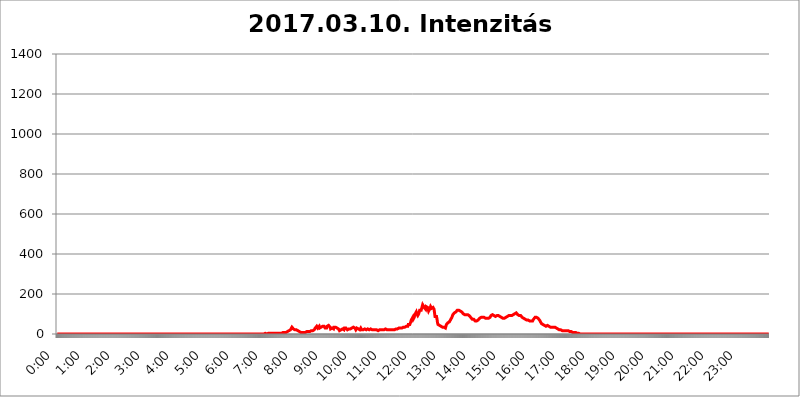
| Category | 2017.03.10. Intenzitás [W/m^2] |
|---|---|
| 0.0 | 0 |
| 0.0006944444444444445 | 0 |
| 0.001388888888888889 | 0 |
| 0.0020833333333333333 | 0 |
| 0.002777777777777778 | 0 |
| 0.003472222222222222 | 0 |
| 0.004166666666666667 | 0 |
| 0.004861111111111111 | 0 |
| 0.005555555555555556 | 0 |
| 0.0062499999999999995 | 0 |
| 0.006944444444444444 | 0 |
| 0.007638888888888889 | 0 |
| 0.008333333333333333 | 0 |
| 0.009027777777777779 | 0 |
| 0.009722222222222222 | 0 |
| 0.010416666666666666 | 0 |
| 0.011111111111111112 | 0 |
| 0.011805555555555555 | 0 |
| 0.012499999999999999 | 0 |
| 0.013194444444444444 | 0 |
| 0.013888888888888888 | 0 |
| 0.014583333333333332 | 0 |
| 0.015277777777777777 | 0 |
| 0.015972222222222224 | 0 |
| 0.016666666666666666 | 0 |
| 0.017361111111111112 | 0 |
| 0.018055555555555557 | 0 |
| 0.01875 | 0 |
| 0.019444444444444445 | 0 |
| 0.02013888888888889 | 0 |
| 0.020833333333333332 | 0 |
| 0.02152777777777778 | 0 |
| 0.022222222222222223 | 0 |
| 0.02291666666666667 | 0 |
| 0.02361111111111111 | 0 |
| 0.024305555555555556 | 0 |
| 0.024999999999999998 | 0 |
| 0.025694444444444447 | 0 |
| 0.02638888888888889 | 0 |
| 0.027083333333333334 | 0 |
| 0.027777777777777776 | 0 |
| 0.02847222222222222 | 0 |
| 0.029166666666666664 | 0 |
| 0.029861111111111113 | 0 |
| 0.030555555555555555 | 0 |
| 0.03125 | 0 |
| 0.03194444444444445 | 0 |
| 0.03263888888888889 | 0 |
| 0.03333333333333333 | 0 |
| 0.034027777777777775 | 0 |
| 0.034722222222222224 | 0 |
| 0.035416666666666666 | 0 |
| 0.036111111111111115 | 0 |
| 0.03680555555555556 | 0 |
| 0.0375 | 0 |
| 0.03819444444444444 | 0 |
| 0.03888888888888889 | 0 |
| 0.03958333333333333 | 0 |
| 0.04027777777777778 | 0 |
| 0.04097222222222222 | 0 |
| 0.041666666666666664 | 0 |
| 0.042361111111111106 | 0 |
| 0.04305555555555556 | 0 |
| 0.043750000000000004 | 0 |
| 0.044444444444444446 | 0 |
| 0.04513888888888889 | 0 |
| 0.04583333333333334 | 0 |
| 0.04652777777777778 | 0 |
| 0.04722222222222222 | 0 |
| 0.04791666666666666 | 0 |
| 0.04861111111111111 | 0 |
| 0.049305555555555554 | 0 |
| 0.049999999999999996 | 0 |
| 0.05069444444444445 | 0 |
| 0.051388888888888894 | 0 |
| 0.052083333333333336 | 0 |
| 0.05277777777777778 | 0 |
| 0.05347222222222222 | 0 |
| 0.05416666666666667 | 0 |
| 0.05486111111111111 | 0 |
| 0.05555555555555555 | 0 |
| 0.05625 | 0 |
| 0.05694444444444444 | 0 |
| 0.057638888888888885 | 0 |
| 0.05833333333333333 | 0 |
| 0.05902777777777778 | 0 |
| 0.059722222222222225 | 0 |
| 0.06041666666666667 | 0 |
| 0.061111111111111116 | 0 |
| 0.06180555555555556 | 0 |
| 0.0625 | 0 |
| 0.06319444444444444 | 0 |
| 0.06388888888888888 | 0 |
| 0.06458333333333334 | 0 |
| 0.06527777777777778 | 0 |
| 0.06597222222222222 | 0 |
| 0.06666666666666667 | 0 |
| 0.06736111111111111 | 0 |
| 0.06805555555555555 | 0 |
| 0.06874999999999999 | 0 |
| 0.06944444444444443 | 0 |
| 0.07013888888888889 | 0 |
| 0.07083333333333333 | 0 |
| 0.07152777777777779 | 0 |
| 0.07222222222222223 | 0 |
| 0.07291666666666667 | 0 |
| 0.07361111111111111 | 0 |
| 0.07430555555555556 | 0 |
| 0.075 | 0 |
| 0.07569444444444444 | 0 |
| 0.0763888888888889 | 0 |
| 0.07708333333333334 | 0 |
| 0.07777777777777778 | 0 |
| 0.07847222222222222 | 0 |
| 0.07916666666666666 | 0 |
| 0.0798611111111111 | 0 |
| 0.08055555555555556 | 0 |
| 0.08125 | 0 |
| 0.08194444444444444 | 0 |
| 0.08263888888888889 | 0 |
| 0.08333333333333333 | 0 |
| 0.08402777777777777 | 0 |
| 0.08472222222222221 | 0 |
| 0.08541666666666665 | 0 |
| 0.08611111111111112 | 0 |
| 0.08680555555555557 | 0 |
| 0.08750000000000001 | 0 |
| 0.08819444444444445 | 0 |
| 0.08888888888888889 | 0 |
| 0.08958333333333333 | 0 |
| 0.09027777777777778 | 0 |
| 0.09097222222222222 | 0 |
| 0.09166666666666667 | 0 |
| 0.09236111111111112 | 0 |
| 0.09305555555555556 | 0 |
| 0.09375 | 0 |
| 0.09444444444444444 | 0 |
| 0.09513888888888888 | 0 |
| 0.09583333333333333 | 0 |
| 0.09652777777777777 | 0 |
| 0.09722222222222222 | 0 |
| 0.09791666666666667 | 0 |
| 0.09861111111111111 | 0 |
| 0.09930555555555555 | 0 |
| 0.09999999999999999 | 0 |
| 0.10069444444444443 | 0 |
| 0.1013888888888889 | 0 |
| 0.10208333333333335 | 0 |
| 0.10277777777777779 | 0 |
| 0.10347222222222223 | 0 |
| 0.10416666666666667 | 0 |
| 0.10486111111111111 | 0 |
| 0.10555555555555556 | 0 |
| 0.10625 | 0 |
| 0.10694444444444444 | 0 |
| 0.1076388888888889 | 0 |
| 0.10833333333333334 | 0 |
| 0.10902777777777778 | 0 |
| 0.10972222222222222 | 0 |
| 0.1111111111111111 | 0 |
| 0.11180555555555556 | 0 |
| 0.11180555555555556 | 0 |
| 0.1125 | 0 |
| 0.11319444444444444 | 0 |
| 0.11388888888888889 | 0 |
| 0.11458333333333333 | 0 |
| 0.11527777777777777 | 0 |
| 0.11597222222222221 | 0 |
| 0.11666666666666665 | 0 |
| 0.1173611111111111 | 0 |
| 0.11805555555555557 | 0 |
| 0.11944444444444445 | 0 |
| 0.12013888888888889 | 0 |
| 0.12083333333333333 | 0 |
| 0.12152777777777778 | 0 |
| 0.12222222222222223 | 0 |
| 0.12291666666666667 | 0 |
| 0.12291666666666667 | 0 |
| 0.12361111111111112 | 0 |
| 0.12430555555555556 | 0 |
| 0.125 | 0 |
| 0.12569444444444444 | 0 |
| 0.12638888888888888 | 0 |
| 0.12708333333333333 | 0 |
| 0.16875 | 0 |
| 0.12847222222222224 | 0 |
| 0.12916666666666668 | 0 |
| 0.12986111111111112 | 0 |
| 0.13055555555555556 | 0 |
| 0.13125 | 0 |
| 0.13194444444444445 | 0 |
| 0.1326388888888889 | 0 |
| 0.13333333333333333 | 0 |
| 0.13402777777777777 | 0 |
| 0.13402777777777777 | 0 |
| 0.13472222222222222 | 0 |
| 0.13541666666666666 | 0 |
| 0.1361111111111111 | 0 |
| 0.13749999999999998 | 0 |
| 0.13819444444444443 | 0 |
| 0.1388888888888889 | 0 |
| 0.13958333333333334 | 0 |
| 0.14027777777777778 | 0 |
| 0.14097222222222222 | 0 |
| 0.14166666666666666 | 0 |
| 0.1423611111111111 | 0 |
| 0.14305555555555557 | 0 |
| 0.14375000000000002 | 0 |
| 0.14444444444444446 | 0 |
| 0.1451388888888889 | 0 |
| 0.1451388888888889 | 0 |
| 0.14652777777777778 | 0 |
| 0.14722222222222223 | 0 |
| 0.14791666666666667 | 0 |
| 0.1486111111111111 | 0 |
| 0.14930555555555555 | 0 |
| 0.15 | 0 |
| 0.15069444444444444 | 0 |
| 0.15138888888888888 | 0 |
| 0.15208333333333332 | 0 |
| 0.15277777777777776 | 0 |
| 0.15347222222222223 | 0 |
| 0.15416666666666667 | 0 |
| 0.15486111111111112 | 0 |
| 0.15555555555555556 | 0 |
| 0.15625 | 0 |
| 0.15694444444444444 | 0 |
| 0.15763888888888888 | 0 |
| 0.15833333333333333 | 0 |
| 0.15902777777777777 | 0 |
| 0.15972222222222224 | 0 |
| 0.16041666666666668 | 0 |
| 0.16111111111111112 | 0 |
| 0.16180555555555556 | 0 |
| 0.1625 | 0 |
| 0.16319444444444445 | 0 |
| 0.1638888888888889 | 0 |
| 0.16458333333333333 | 0 |
| 0.16527777777777777 | 0 |
| 0.16597222222222222 | 0 |
| 0.16666666666666666 | 0 |
| 0.1673611111111111 | 0 |
| 0.16805555555555554 | 0 |
| 0.16874999999999998 | 0 |
| 0.16944444444444443 | 0 |
| 0.17013888888888887 | 0 |
| 0.1708333333333333 | 0 |
| 0.17152777777777775 | 0 |
| 0.17222222222222225 | 0 |
| 0.1729166666666667 | 0 |
| 0.17361111111111113 | 0 |
| 0.17430555555555557 | 0 |
| 0.17500000000000002 | 0 |
| 0.17569444444444446 | 0 |
| 0.1763888888888889 | 0 |
| 0.17708333333333334 | 0 |
| 0.17777777777777778 | 0 |
| 0.17847222222222223 | 0 |
| 0.17916666666666667 | 0 |
| 0.1798611111111111 | 0 |
| 0.18055555555555555 | 0 |
| 0.18125 | 0 |
| 0.18194444444444444 | 0 |
| 0.1826388888888889 | 0 |
| 0.18333333333333335 | 0 |
| 0.1840277777777778 | 0 |
| 0.18472222222222223 | 0 |
| 0.18541666666666667 | 0 |
| 0.18611111111111112 | 0 |
| 0.18680555555555556 | 0 |
| 0.1875 | 0 |
| 0.18819444444444444 | 0 |
| 0.18888888888888888 | 0 |
| 0.18958333333333333 | 0 |
| 0.19027777777777777 | 0 |
| 0.1909722222222222 | 0 |
| 0.19166666666666665 | 0 |
| 0.19236111111111112 | 0 |
| 0.19305555555555554 | 0 |
| 0.19375 | 0 |
| 0.19444444444444445 | 0 |
| 0.1951388888888889 | 0 |
| 0.19583333333333333 | 0 |
| 0.19652777777777777 | 0 |
| 0.19722222222222222 | 0 |
| 0.19791666666666666 | 0 |
| 0.1986111111111111 | 0 |
| 0.19930555555555554 | 0 |
| 0.19999999999999998 | 0 |
| 0.20069444444444443 | 0 |
| 0.20138888888888887 | 0 |
| 0.2020833333333333 | 0 |
| 0.2027777777777778 | 0 |
| 0.2034722222222222 | 0 |
| 0.2041666666666667 | 0 |
| 0.20486111111111113 | 0 |
| 0.20555555555555557 | 0 |
| 0.20625000000000002 | 0 |
| 0.20694444444444446 | 0 |
| 0.2076388888888889 | 0 |
| 0.20833333333333334 | 0 |
| 0.20902777777777778 | 0 |
| 0.20972222222222223 | 0 |
| 0.21041666666666667 | 0 |
| 0.2111111111111111 | 0 |
| 0.21180555555555555 | 0 |
| 0.2125 | 0 |
| 0.21319444444444444 | 0 |
| 0.2138888888888889 | 0 |
| 0.21458333333333335 | 0 |
| 0.2152777777777778 | 0 |
| 0.21597222222222223 | 0 |
| 0.21666666666666667 | 0 |
| 0.21736111111111112 | 0 |
| 0.21805555555555556 | 0 |
| 0.21875 | 0 |
| 0.21944444444444444 | 0 |
| 0.22013888888888888 | 0 |
| 0.22083333333333333 | 0 |
| 0.22152777777777777 | 0 |
| 0.2222222222222222 | 0 |
| 0.22291666666666665 | 0 |
| 0.2236111111111111 | 0 |
| 0.22430555555555556 | 0 |
| 0.225 | 0 |
| 0.22569444444444445 | 0 |
| 0.2263888888888889 | 0 |
| 0.22708333333333333 | 0 |
| 0.22777777777777777 | 0 |
| 0.22847222222222222 | 0 |
| 0.22916666666666666 | 0 |
| 0.2298611111111111 | 0 |
| 0.23055555555555554 | 0 |
| 0.23124999999999998 | 0 |
| 0.23194444444444443 | 0 |
| 0.23263888888888887 | 0 |
| 0.2333333333333333 | 0 |
| 0.2340277777777778 | 0 |
| 0.2347222222222222 | 0 |
| 0.2354166666666667 | 0 |
| 0.23611111111111113 | 0 |
| 0.23680555555555557 | 0 |
| 0.23750000000000002 | 0 |
| 0.23819444444444446 | 0 |
| 0.2388888888888889 | 0 |
| 0.23958333333333334 | 0 |
| 0.24027777777777778 | 0 |
| 0.24097222222222223 | 0 |
| 0.24166666666666667 | 0 |
| 0.2423611111111111 | 0 |
| 0.24305555555555555 | 0 |
| 0.24375 | 0 |
| 0.24444444444444446 | 0 |
| 0.24513888888888888 | 0 |
| 0.24583333333333335 | 0 |
| 0.2465277777777778 | 0 |
| 0.24722222222222223 | 0 |
| 0.24791666666666667 | 0 |
| 0.24861111111111112 | 0 |
| 0.24930555555555556 | 0 |
| 0.25 | 0 |
| 0.25069444444444444 | 0 |
| 0.2513888888888889 | 0 |
| 0.2520833333333333 | 0 |
| 0.25277777777777777 | 0 |
| 0.2534722222222222 | 0 |
| 0.25416666666666665 | 0 |
| 0.2548611111111111 | 0 |
| 0.2555555555555556 | 0 |
| 0.25625000000000003 | 0 |
| 0.2569444444444445 | 0 |
| 0.2576388888888889 | 0 |
| 0.25833333333333336 | 0 |
| 0.2590277777777778 | 0 |
| 0.25972222222222224 | 0 |
| 0.2604166666666667 | 0 |
| 0.2611111111111111 | 0 |
| 0.26180555555555557 | 0 |
| 0.2625 | 0 |
| 0.26319444444444445 | 0 |
| 0.2638888888888889 | 0 |
| 0.26458333333333334 | 0 |
| 0.2652777777777778 | 0 |
| 0.2659722222222222 | 0 |
| 0.26666666666666666 | 0 |
| 0.2673611111111111 | 0 |
| 0.26805555555555555 | 0 |
| 0.26875 | 0 |
| 0.26944444444444443 | 0 |
| 0.2701388888888889 | 0 |
| 0.2708333333333333 | 0 |
| 0.27152777777777776 | 0 |
| 0.2722222222222222 | 0 |
| 0.27291666666666664 | 0 |
| 0.2736111111111111 | 0 |
| 0.2743055555555555 | 0 |
| 0.27499999999999997 | 0 |
| 0.27569444444444446 | 0 |
| 0.27638888888888885 | 0 |
| 0.27708333333333335 | 0 |
| 0.2777777777777778 | 0 |
| 0.27847222222222223 | 0 |
| 0.2791666666666667 | 0 |
| 0.2798611111111111 | 0 |
| 0.28055555555555556 | 0 |
| 0.28125 | 0 |
| 0.28194444444444444 | 0 |
| 0.2826388888888889 | 0 |
| 0.2833333333333333 | 0 |
| 0.28402777777777777 | 0 |
| 0.2847222222222222 | 0 |
| 0.28541666666666665 | 0 |
| 0.28611111111111115 | 0 |
| 0.28680555555555554 | 0 |
| 0.28750000000000003 | 0 |
| 0.2881944444444445 | 0 |
| 0.2888888888888889 | 0 |
| 0.28958333333333336 | 0 |
| 0.2902777777777778 | 0 |
| 0.29097222222222224 | 0 |
| 0.2916666666666667 | 3.525 |
| 0.2923611111111111 | 3.525 |
| 0.29305555555555557 | 0 |
| 0.29375 | 0 |
| 0.29444444444444445 | 3.525 |
| 0.2951388888888889 | 3.525 |
| 0.29583333333333334 | 3.525 |
| 0.2965277777777778 | 3.525 |
| 0.2972222222222222 | 3.525 |
| 0.29791666666666666 | 3.525 |
| 0.2986111111111111 | 3.525 |
| 0.29930555555555555 | 3.525 |
| 0.3 | 3.525 |
| 0.30069444444444443 | 3.525 |
| 0.3013888888888889 | 3.525 |
| 0.3020833333333333 | 3.525 |
| 0.30277777777777776 | 3.525 |
| 0.3034722222222222 | 3.525 |
| 0.30416666666666664 | 3.525 |
| 0.3048611111111111 | 3.525 |
| 0.3055555555555555 | 3.525 |
| 0.30624999999999997 | 3.525 |
| 0.3069444444444444 | 3.525 |
| 0.3076388888888889 | 3.525 |
| 0.30833333333333335 | 3.525 |
| 0.3090277777777778 | 3.525 |
| 0.30972222222222223 | 3.525 |
| 0.3104166666666667 | 3.525 |
| 0.3111111111111111 | 3.525 |
| 0.31180555555555556 | 3.525 |
| 0.3125 | 3.525 |
| 0.31319444444444444 | 3.525 |
| 0.3138888888888889 | 3.525 |
| 0.3145833333333333 | 3.525 |
| 0.31527777777777777 | 7.887 |
| 0.3159722222222222 | 7.887 |
| 0.31666666666666665 | 7.887 |
| 0.31736111111111115 | 7.887 |
| 0.31805555555555554 | 7.887 |
| 0.31875000000000003 | 7.887 |
| 0.3194444444444445 | 7.887 |
| 0.3201388888888889 | 7.887 |
| 0.32083333333333336 | 7.887 |
| 0.3215277777777778 | 7.887 |
| 0.32222222222222224 | 12.257 |
| 0.3229166666666667 | 12.257 |
| 0.3236111111111111 | 12.257 |
| 0.32430555555555557 | 12.257 |
| 0.325 | 16.636 |
| 0.32569444444444445 | 16.636 |
| 0.3263888888888889 | 16.636 |
| 0.32708333333333334 | 21.024 |
| 0.3277777777777778 | 21.024 |
| 0.3284722222222222 | 25.419 |
| 0.32916666666666666 | 34.234 |
| 0.3298611111111111 | 38.653 |
| 0.33055555555555555 | 29.823 |
| 0.33125 | 25.419 |
| 0.33194444444444443 | 21.024 |
| 0.3326388888888889 | 21.024 |
| 0.3333333333333333 | 21.024 |
| 0.3340277777777778 | 16.636 |
| 0.3347222222222222 | 16.636 |
| 0.3354166666666667 | 21.024 |
| 0.3361111111111111 | 21.024 |
| 0.3368055555555556 | 16.636 |
| 0.33749999999999997 | 16.636 |
| 0.33819444444444446 | 12.257 |
| 0.33888888888888885 | 12.257 |
| 0.33958333333333335 | 12.257 |
| 0.34027777777777773 | 12.257 |
| 0.34097222222222223 | 12.257 |
| 0.3416666666666666 | 7.887 |
| 0.3423611111111111 | 7.887 |
| 0.3430555555555555 | 7.887 |
| 0.34375 | 7.887 |
| 0.3444444444444445 | 7.887 |
| 0.3451388888888889 | 7.887 |
| 0.3458333333333334 | 7.887 |
| 0.34652777777777777 | 7.887 |
| 0.34722222222222227 | 7.887 |
| 0.34791666666666665 | 7.887 |
| 0.34861111111111115 | 7.887 |
| 0.34930555555555554 | 12.257 |
| 0.35000000000000003 | 12.257 |
| 0.3506944444444444 | 7.887 |
| 0.3513888888888889 | 7.887 |
| 0.3520833333333333 | 12.257 |
| 0.3527777777777778 | 12.257 |
| 0.3534722222222222 | 12.257 |
| 0.3541666666666667 | 12.257 |
| 0.3548611111111111 | 12.257 |
| 0.35555555555555557 | 12.257 |
| 0.35625 | 16.636 |
| 0.35694444444444445 | 16.636 |
| 0.3576388888888889 | 16.636 |
| 0.35833333333333334 | 16.636 |
| 0.3590277777777778 | 16.636 |
| 0.3597222222222222 | 16.636 |
| 0.36041666666666666 | 21.024 |
| 0.3611111111111111 | 25.419 |
| 0.36180555555555555 | 29.823 |
| 0.3625 | 29.823 |
| 0.36319444444444443 | 29.823 |
| 0.3638888888888889 | 38.653 |
| 0.3645833333333333 | 34.234 |
| 0.3652777777777778 | 29.823 |
| 0.3659722222222222 | 25.419 |
| 0.3666666666666667 | 29.823 |
| 0.3673611111111111 | 38.653 |
| 0.3680555555555556 | 29.823 |
| 0.36874999999999997 | 29.823 |
| 0.36944444444444446 | 34.234 |
| 0.37013888888888885 | 34.234 |
| 0.37083333333333335 | 38.653 |
| 0.37152777777777773 | 34.234 |
| 0.37222222222222223 | 38.653 |
| 0.3729166666666666 | 43.079 |
| 0.3736111111111111 | 43.079 |
| 0.3743055555555555 | 38.653 |
| 0.375 | 34.234 |
| 0.3756944444444445 | 29.823 |
| 0.3763888888888889 | 25.419 |
| 0.3770833333333334 | 25.419 |
| 0.37777777777777777 | 29.823 |
| 0.37847222222222227 | 38.653 |
| 0.37916666666666665 | 34.234 |
| 0.37986111111111115 | 38.653 |
| 0.38055555555555554 | 43.079 |
| 0.38125000000000003 | 43.079 |
| 0.3819444444444444 | 43.079 |
| 0.3826388888888889 | 34.234 |
| 0.3833333333333333 | 25.419 |
| 0.3840277777777778 | 25.419 |
| 0.3847222222222222 | 25.419 |
| 0.3854166666666667 | 29.823 |
| 0.3861111111111111 | 29.823 |
| 0.38680555555555557 | 25.419 |
| 0.3875 | 25.419 |
| 0.38819444444444445 | 34.234 |
| 0.3888888888888889 | 34.234 |
| 0.38958333333333334 | 34.234 |
| 0.3902777777777778 | 34.234 |
| 0.3909722222222222 | 34.234 |
| 0.39166666666666666 | 29.823 |
| 0.3923611111111111 | 29.823 |
| 0.39305555555555555 | 29.823 |
| 0.39375 | 29.823 |
| 0.39444444444444443 | 25.419 |
| 0.3951388888888889 | 21.024 |
| 0.3958333333333333 | 16.636 |
| 0.3965277777777778 | 21.024 |
| 0.3972222222222222 | 21.024 |
| 0.3979166666666667 | 21.024 |
| 0.3986111111111111 | 21.024 |
| 0.3993055555555556 | 25.419 |
| 0.39999999999999997 | 25.419 |
| 0.40069444444444446 | 25.419 |
| 0.40138888888888885 | 25.419 |
| 0.40208333333333335 | 21.024 |
| 0.40277777777777773 | 29.823 |
| 0.40347222222222223 | 34.234 |
| 0.4041666666666666 | 29.823 |
| 0.4048611111111111 | 29.823 |
| 0.4055555555555555 | 29.823 |
| 0.40625 | 25.419 |
| 0.4069444444444445 | 21.024 |
| 0.4076388888888889 | 21.024 |
| 0.4083333333333334 | 21.024 |
| 0.40902777777777777 | 25.419 |
| 0.40972222222222227 | 25.419 |
| 0.41041666666666665 | 29.823 |
| 0.41111111111111115 | 25.419 |
| 0.41180555555555554 | 25.419 |
| 0.41250000000000003 | 29.823 |
| 0.4131944444444444 | 29.823 |
| 0.4138888888888889 | 34.234 |
| 0.4145833333333333 | 29.823 |
| 0.4152777777777778 | 34.234 |
| 0.4159722222222222 | 29.823 |
| 0.4166666666666667 | 29.823 |
| 0.4173611111111111 | 29.823 |
| 0.41805555555555557 | 25.419 |
| 0.41875 | 21.024 |
| 0.41944444444444445 | 25.419 |
| 0.4201388888888889 | 29.823 |
| 0.42083333333333334 | 29.823 |
| 0.4215277777777778 | 29.823 |
| 0.4222222222222222 | 25.419 |
| 0.42291666666666666 | 21.024 |
| 0.4236111111111111 | 21.024 |
| 0.42430555555555555 | 21.024 |
| 0.425 | 21.024 |
| 0.42569444444444443 | 29.823 |
| 0.4263888888888889 | 25.419 |
| 0.4270833333333333 | 21.024 |
| 0.4277777777777778 | 21.024 |
| 0.4284722222222222 | 21.024 |
| 0.4291666666666667 | 21.024 |
| 0.4298611111111111 | 21.024 |
| 0.4305555555555556 | 25.419 |
| 0.43124999999999997 | 25.419 |
| 0.43194444444444446 | 29.823 |
| 0.43263888888888885 | 21.024 |
| 0.43333333333333335 | 21.024 |
| 0.43402777777777773 | 21.024 |
| 0.43472222222222223 | 21.024 |
| 0.4354166666666666 | 25.419 |
| 0.4361111111111111 | 21.024 |
| 0.4368055555555555 | 21.024 |
| 0.4375 | 21.024 |
| 0.4381944444444445 | 25.419 |
| 0.4388888888888889 | 25.419 |
| 0.4395833333333334 | 25.419 |
| 0.44027777777777777 | 25.419 |
| 0.44097222222222227 | 25.419 |
| 0.44166666666666665 | 21.024 |
| 0.44236111111111115 | 21.024 |
| 0.44305555555555554 | 21.024 |
| 0.44375000000000003 | 21.024 |
| 0.4444444444444444 | 21.024 |
| 0.4451388888888889 | 21.024 |
| 0.4458333333333333 | 21.024 |
| 0.4465277777777778 | 21.024 |
| 0.4472222222222222 | 21.024 |
| 0.4479166666666667 | 21.024 |
| 0.4486111111111111 | 21.024 |
| 0.44930555555555557 | 21.024 |
| 0.45 | 16.636 |
| 0.45069444444444445 | 21.024 |
| 0.4513888888888889 | 21.024 |
| 0.45208333333333334 | 21.024 |
| 0.4527777777777778 | 21.024 |
| 0.4534722222222222 | 21.024 |
| 0.45416666666666666 | 21.024 |
| 0.4548611111111111 | 25.419 |
| 0.45555555555555555 | 21.024 |
| 0.45625 | 21.024 |
| 0.45694444444444443 | 25.419 |
| 0.4576388888888889 | 25.419 |
| 0.4583333333333333 | 21.024 |
| 0.4590277777777778 | 21.024 |
| 0.4597222222222222 | 21.024 |
| 0.4604166666666667 | 25.419 |
| 0.4611111111111111 | 21.024 |
| 0.4618055555555556 | 21.024 |
| 0.46249999999999997 | 21.024 |
| 0.46319444444444446 | 21.024 |
| 0.46388888888888885 | 21.024 |
| 0.46458333333333335 | 21.024 |
| 0.46527777777777773 | 21.024 |
| 0.46597222222222223 | 21.024 |
| 0.4666666666666666 | 21.024 |
| 0.4673611111111111 | 21.024 |
| 0.4680555555555555 | 21.024 |
| 0.46875 | 21.024 |
| 0.4694444444444445 | 21.024 |
| 0.4701388888888889 | 21.024 |
| 0.4708333333333334 | 21.024 |
| 0.47152777777777777 | 21.024 |
| 0.47222222222222227 | 21.024 |
| 0.47291666666666665 | 21.024 |
| 0.47361111111111115 | 21.024 |
| 0.47430555555555554 | 25.419 |
| 0.47500000000000003 | 25.419 |
| 0.4756944444444444 | 25.419 |
| 0.4763888888888889 | 25.419 |
| 0.4770833333333333 | 25.419 |
| 0.4777777777777778 | 25.419 |
| 0.4784722222222222 | 25.419 |
| 0.4791666666666667 | 29.823 |
| 0.4798611111111111 | 29.823 |
| 0.48055555555555557 | 29.823 |
| 0.48125 | 29.823 |
| 0.48194444444444445 | 29.823 |
| 0.4826388888888889 | 29.823 |
| 0.48333333333333334 | 29.823 |
| 0.4840277777777778 | 29.823 |
| 0.4847222222222222 | 29.823 |
| 0.48541666666666666 | 34.234 |
| 0.4861111111111111 | 29.823 |
| 0.48680555555555555 | 34.234 |
| 0.4875 | 34.234 |
| 0.48819444444444443 | 34.234 |
| 0.4888888888888889 | 38.653 |
| 0.4895833333333333 | 38.653 |
| 0.4902777777777778 | 34.234 |
| 0.4909722222222222 | 34.234 |
| 0.4916666666666667 | 38.653 |
| 0.4923611111111111 | 47.511 |
| 0.4930555555555556 | 43.079 |
| 0.49374999999999997 | 43.079 |
| 0.49444444444444446 | 47.511 |
| 0.49513888888888885 | 47.511 |
| 0.49583333333333335 | 60.85 |
| 0.49652777777777773 | 69.775 |
| 0.49722222222222223 | 65.31 |
| 0.4979166666666666 | 74.246 |
| 0.4986111111111111 | 83.205 |
| 0.4993055555555555 | 74.246 |
| 0.5 | 74.246 |
| 0.5006944444444444 | 83.205 |
| 0.5013888888888889 | 96.682 |
| 0.5020833333333333 | 96.682 |
| 0.5027777777777778 | 101.184 |
| 0.5034722222222222 | 110.201 |
| 0.5041666666666667 | 101.184 |
| 0.5048611111111111 | 96.682 |
| 0.5055555555555555 | 92.184 |
| 0.50625 | 87.692 |
| 0.5069444444444444 | 101.184 |
| 0.5076388888888889 | 105.69 |
| 0.5083333333333333 | 119.235 |
| 0.5090277777777777 | 114.716 |
| 0.5097222222222222 | 114.716 |
| 0.5104166666666666 | 119.235 |
| 0.5111111111111112 | 128.284 |
| 0.5118055555555555 | 137.347 |
| 0.5125000000000001 | 128.284 |
| 0.5131944444444444 | 141.884 |
| 0.513888888888889 | 137.347 |
| 0.5145833333333333 | 132.814 |
| 0.5152777777777778 | 128.284 |
| 0.5159722222222222 | 128.284 |
| 0.5166666666666667 | 123.758 |
| 0.517361111111111 | 137.347 |
| 0.5180555555555556 | 141.884 |
| 0.5187499999999999 | 137.347 |
| 0.5194444444444445 | 132.814 |
| 0.5201388888888888 | 128.284 |
| 0.5208333333333334 | 114.716 |
| 0.5215277777777778 | 114.716 |
| 0.5222222222222223 | 123.758 |
| 0.5229166666666667 | 123.758 |
| 0.5236111111111111 | 137.347 |
| 0.5243055555555556 | 132.814 |
| 0.525 | 128.284 |
| 0.5256944444444445 | 128.284 |
| 0.5263888888888889 | 132.814 |
| 0.5270833333333333 | 132.814 |
| 0.5277777777777778 | 128.284 |
| 0.5284722222222222 | 123.758 |
| 0.5291666666666667 | 105.69 |
| 0.5298611111111111 | 87.692 |
| 0.5305555555555556 | 92.184 |
| 0.53125 | 87.692 |
| 0.5319444444444444 | 87.692 |
| 0.5326388888888889 | 74.246 |
| 0.5333333333333333 | 56.398 |
| 0.5340277777777778 | 47.511 |
| 0.5347222222222222 | 47.511 |
| 0.5354166666666667 | 47.511 |
| 0.5361111111111111 | 43.079 |
| 0.5368055555555555 | 38.653 |
| 0.5375 | 38.653 |
| 0.5381944444444444 | 38.653 |
| 0.5388888888888889 | 38.653 |
| 0.5395833333333333 | 38.653 |
| 0.5402777777777777 | 34.234 |
| 0.5409722222222222 | 38.653 |
| 0.5416666666666666 | 38.653 |
| 0.5423611111111112 | 34.234 |
| 0.5430555555555555 | 29.823 |
| 0.5437500000000001 | 29.823 |
| 0.5444444444444444 | 29.823 |
| 0.545138888888889 | 38.653 |
| 0.5458333333333333 | 47.511 |
| 0.5465277777777778 | 43.079 |
| 0.5472222222222222 | 43.079 |
| 0.5479166666666667 | 56.398 |
| 0.548611111111111 | 51.951 |
| 0.5493055555555556 | 60.85 |
| 0.5499999999999999 | 60.85 |
| 0.5506944444444445 | 60.85 |
| 0.5513888888888888 | 65.31 |
| 0.5520833333333334 | 74.246 |
| 0.5527777777777778 | 78.722 |
| 0.5534722222222223 | 83.205 |
| 0.5541666666666667 | 83.205 |
| 0.5548611111111111 | 96.682 |
| 0.5555555555555556 | 92.184 |
| 0.55625 | 96.682 |
| 0.5569444444444445 | 105.69 |
| 0.5576388888888889 | 105.69 |
| 0.5583333333333333 | 105.69 |
| 0.5590277777777778 | 110.201 |
| 0.5597222222222222 | 114.716 |
| 0.5604166666666667 | 114.716 |
| 0.5611111111111111 | 119.235 |
| 0.5618055555555556 | 119.235 |
| 0.5625 | 119.235 |
| 0.5631944444444444 | 119.235 |
| 0.5638888888888889 | 119.235 |
| 0.5645833333333333 | 119.235 |
| 0.5652777777777778 | 114.716 |
| 0.5659722222222222 | 110.201 |
| 0.5666666666666667 | 110.201 |
| 0.5673611111111111 | 110.201 |
| 0.5680555555555555 | 105.69 |
| 0.56875 | 105.69 |
| 0.5694444444444444 | 101.184 |
| 0.5701388888888889 | 101.184 |
| 0.5708333333333333 | 96.682 |
| 0.5715277777777777 | 96.682 |
| 0.5722222222222222 | 96.682 |
| 0.5729166666666666 | 96.682 |
| 0.5736111111111112 | 96.682 |
| 0.5743055555555555 | 96.682 |
| 0.5750000000000001 | 96.682 |
| 0.5756944444444444 | 96.682 |
| 0.576388888888889 | 96.682 |
| 0.5770833333333333 | 92.184 |
| 0.5777777777777778 | 92.184 |
| 0.5784722222222222 | 87.692 |
| 0.5791666666666667 | 87.692 |
| 0.579861111111111 | 83.205 |
| 0.5805555555555556 | 83.205 |
| 0.5812499999999999 | 78.722 |
| 0.5819444444444445 | 74.246 |
| 0.5826388888888888 | 74.246 |
| 0.5833333333333334 | 74.246 |
| 0.5840277777777778 | 74.246 |
| 0.5847222222222223 | 69.775 |
| 0.5854166666666667 | 69.775 |
| 0.5861111111111111 | 65.31 |
| 0.5868055555555556 | 65.31 |
| 0.5875 | 65.31 |
| 0.5881944444444445 | 65.31 |
| 0.5888888888888889 | 65.31 |
| 0.5895833333333333 | 69.775 |
| 0.5902777777777778 | 69.775 |
| 0.5909722222222222 | 69.775 |
| 0.5916666666666667 | 74.246 |
| 0.5923611111111111 | 78.722 |
| 0.5930555555555556 | 78.722 |
| 0.59375 | 83.205 |
| 0.5944444444444444 | 83.205 |
| 0.5951388888888889 | 87.692 |
| 0.5958333333333333 | 87.692 |
| 0.5965277777777778 | 83.205 |
| 0.5972222222222222 | 83.205 |
| 0.5979166666666667 | 83.205 |
| 0.5986111111111111 | 83.205 |
| 0.5993055555555555 | 83.205 |
| 0.6 | 83.205 |
| 0.6006944444444444 | 78.722 |
| 0.6013888888888889 | 78.722 |
| 0.6020833333333333 | 78.722 |
| 0.6027777777777777 | 78.722 |
| 0.6034722222222222 | 78.722 |
| 0.6041666666666666 | 78.722 |
| 0.6048611111111112 | 78.722 |
| 0.6055555555555555 | 83.205 |
| 0.6062500000000001 | 83.205 |
| 0.6069444444444444 | 83.205 |
| 0.607638888888889 | 87.692 |
| 0.6083333333333333 | 92.184 |
| 0.6090277777777778 | 92.184 |
| 0.6097222222222222 | 96.682 |
| 0.6104166666666667 | 96.682 |
| 0.611111111111111 | 96.682 |
| 0.6118055555555556 | 96.682 |
| 0.6124999999999999 | 92.184 |
| 0.6131944444444445 | 92.184 |
| 0.6138888888888888 | 92.184 |
| 0.6145833333333334 | 87.692 |
| 0.6152777777777778 | 87.692 |
| 0.6159722222222223 | 87.692 |
| 0.6166666666666667 | 92.184 |
| 0.6173611111111111 | 92.184 |
| 0.6180555555555556 | 92.184 |
| 0.61875 | 92.184 |
| 0.6194444444444445 | 92.184 |
| 0.6201388888888889 | 92.184 |
| 0.6208333333333333 | 87.692 |
| 0.6215277777777778 | 83.205 |
| 0.6222222222222222 | 83.205 |
| 0.6229166666666667 | 83.205 |
| 0.6236111111111111 | 78.722 |
| 0.6243055555555556 | 78.722 |
| 0.625 | 78.722 |
| 0.6256944444444444 | 78.722 |
| 0.6263888888888889 | 78.722 |
| 0.6270833333333333 | 78.722 |
| 0.6277777777777778 | 83.205 |
| 0.6284722222222222 | 83.205 |
| 0.6291666666666667 | 83.205 |
| 0.6298611111111111 | 87.692 |
| 0.6305555555555555 | 87.692 |
| 0.63125 | 87.692 |
| 0.6319444444444444 | 87.692 |
| 0.6326388888888889 | 92.184 |
| 0.6333333333333333 | 92.184 |
| 0.6340277777777777 | 92.184 |
| 0.6347222222222222 | 92.184 |
| 0.6354166666666666 | 92.184 |
| 0.6361111111111112 | 92.184 |
| 0.6368055555555555 | 92.184 |
| 0.6375000000000001 | 92.184 |
| 0.6381944444444444 | 96.682 |
| 0.638888888888889 | 96.682 |
| 0.6395833333333333 | 96.682 |
| 0.6402777777777778 | 101.184 |
| 0.6409722222222222 | 101.184 |
| 0.6416666666666667 | 101.184 |
| 0.642361111111111 | 105.69 |
| 0.6430555555555556 | 105.69 |
| 0.6437499999999999 | 105.69 |
| 0.6444444444444445 | 101.184 |
| 0.6451388888888888 | 101.184 |
| 0.6458333333333334 | 96.682 |
| 0.6465277777777778 | 96.682 |
| 0.6472222222222223 | 92.184 |
| 0.6479166666666667 | 92.184 |
| 0.6486111111111111 | 92.184 |
| 0.6493055555555556 | 92.184 |
| 0.65 | 92.184 |
| 0.6506944444444445 | 87.692 |
| 0.6513888888888889 | 87.692 |
| 0.6520833333333333 | 83.205 |
| 0.6527777777777778 | 78.722 |
| 0.6534722222222222 | 78.722 |
| 0.6541666666666667 | 78.722 |
| 0.6548611111111111 | 74.246 |
| 0.6555555555555556 | 74.246 |
| 0.65625 | 74.246 |
| 0.6569444444444444 | 74.246 |
| 0.6576388888888889 | 74.246 |
| 0.6583333333333333 | 69.775 |
| 0.6590277777777778 | 69.775 |
| 0.6597222222222222 | 69.775 |
| 0.6604166666666667 | 69.775 |
| 0.6611111111111111 | 69.775 |
| 0.6618055555555555 | 69.775 |
| 0.6625 | 65.31 |
| 0.6631944444444444 | 65.31 |
| 0.6638888888888889 | 65.31 |
| 0.6645833333333333 | 65.31 |
| 0.6652777777777777 | 65.31 |
| 0.6659722222222222 | 65.31 |
| 0.6666666666666666 | 65.31 |
| 0.6673611111111111 | 69.775 |
| 0.6680555555555556 | 74.246 |
| 0.6687500000000001 | 74.246 |
| 0.6694444444444444 | 78.722 |
| 0.6701388888888888 | 83.205 |
| 0.6708333333333334 | 83.205 |
| 0.6715277777777778 | 83.205 |
| 0.6722222222222222 | 83.205 |
| 0.6729166666666666 | 83.205 |
| 0.6736111111111112 | 78.722 |
| 0.6743055555555556 | 78.722 |
| 0.6749999999999999 | 74.246 |
| 0.6756944444444444 | 74.246 |
| 0.6763888888888889 | 69.775 |
| 0.6770833333333334 | 65.31 |
| 0.6777777777777777 | 60.85 |
| 0.6784722222222223 | 56.398 |
| 0.6791666666666667 | 51.951 |
| 0.6798611111111111 | 47.511 |
| 0.6805555555555555 | 47.511 |
| 0.68125 | 47.511 |
| 0.6819444444444445 | 43.079 |
| 0.6826388888888889 | 43.079 |
| 0.6833333333333332 | 43.079 |
| 0.6840277777777778 | 38.653 |
| 0.6847222222222222 | 38.653 |
| 0.6854166666666667 | 38.653 |
| 0.686111111111111 | 43.079 |
| 0.6868055555555556 | 43.079 |
| 0.6875 | 43.079 |
| 0.6881944444444444 | 43.079 |
| 0.688888888888889 | 38.653 |
| 0.6895833333333333 | 38.653 |
| 0.6902777777777778 | 38.653 |
| 0.6909722222222222 | 38.653 |
| 0.6916666666666668 | 34.234 |
| 0.6923611111111111 | 34.234 |
| 0.6930555555555555 | 34.234 |
| 0.69375 | 34.234 |
| 0.6944444444444445 | 34.234 |
| 0.6951388888888889 | 34.234 |
| 0.6958333333333333 | 34.234 |
| 0.6965277777777777 | 34.234 |
| 0.6972222222222223 | 34.234 |
| 0.6979166666666666 | 34.234 |
| 0.6986111111111111 | 29.823 |
| 0.6993055555555556 | 29.823 |
| 0.7000000000000001 | 29.823 |
| 0.7006944444444444 | 29.823 |
| 0.7013888888888888 | 25.419 |
| 0.7020833333333334 | 25.419 |
| 0.7027777777777778 | 25.419 |
| 0.7034722222222222 | 21.024 |
| 0.7041666666666666 | 21.024 |
| 0.7048611111111112 | 21.024 |
| 0.7055555555555556 | 21.024 |
| 0.7062499999999999 | 21.024 |
| 0.7069444444444444 | 16.636 |
| 0.7076388888888889 | 16.636 |
| 0.7083333333333334 | 16.636 |
| 0.7090277777777777 | 16.636 |
| 0.7097222222222223 | 16.636 |
| 0.7104166666666667 | 16.636 |
| 0.7111111111111111 | 16.636 |
| 0.7118055555555555 | 16.636 |
| 0.7125 | 16.636 |
| 0.7131944444444445 | 16.636 |
| 0.7138888888888889 | 16.636 |
| 0.7145833333333332 | 16.636 |
| 0.7152777777777778 | 16.636 |
| 0.7159722222222222 | 16.636 |
| 0.7166666666666667 | 16.636 |
| 0.717361111111111 | 16.636 |
| 0.7180555555555556 | 12.257 |
| 0.71875 | 12.257 |
| 0.7194444444444444 | 12.257 |
| 0.720138888888889 | 12.257 |
| 0.7208333333333333 | 12.257 |
| 0.7215277777777778 | 12.257 |
| 0.7222222222222222 | 7.887 |
| 0.7229166666666668 | 7.887 |
| 0.7236111111111111 | 7.887 |
| 0.7243055555555555 | 7.887 |
| 0.725 | 7.887 |
| 0.7256944444444445 | 7.887 |
| 0.7263888888888889 | 7.887 |
| 0.7270833333333333 | 7.887 |
| 0.7277777777777777 | 3.525 |
| 0.7284722222222223 | 3.525 |
| 0.7291666666666666 | 3.525 |
| 0.7298611111111111 | 3.525 |
| 0.7305555555555556 | 3.525 |
| 0.7312500000000001 | 3.525 |
| 0.7319444444444444 | 3.525 |
| 0.7326388888888888 | 3.525 |
| 0.7333333333333334 | 0 |
| 0.7340277777777778 | 0 |
| 0.7347222222222222 | 0 |
| 0.7354166666666666 | 0 |
| 0.7361111111111112 | 0 |
| 0.7368055555555556 | 0 |
| 0.7374999999999999 | 0 |
| 0.7381944444444444 | 0 |
| 0.7388888888888889 | 0 |
| 0.7395833333333334 | 0 |
| 0.7402777777777777 | 0 |
| 0.7409722222222223 | 0 |
| 0.7416666666666667 | 0 |
| 0.7423611111111111 | 0 |
| 0.7430555555555555 | 0 |
| 0.74375 | 0 |
| 0.7444444444444445 | 0 |
| 0.7451388888888889 | 0 |
| 0.7458333333333332 | 0 |
| 0.7465277777777778 | 0 |
| 0.7472222222222222 | 0 |
| 0.7479166666666667 | 0 |
| 0.748611111111111 | 0 |
| 0.7493055555555556 | 0 |
| 0.75 | 0 |
| 0.7506944444444444 | 0 |
| 0.751388888888889 | 0 |
| 0.7520833333333333 | 0 |
| 0.7527777777777778 | 0 |
| 0.7534722222222222 | 0 |
| 0.7541666666666668 | 0 |
| 0.7548611111111111 | 0 |
| 0.7555555555555555 | 0 |
| 0.75625 | 0 |
| 0.7569444444444445 | 0 |
| 0.7576388888888889 | 0 |
| 0.7583333333333333 | 0 |
| 0.7590277777777777 | 0 |
| 0.7597222222222223 | 0 |
| 0.7604166666666666 | 0 |
| 0.7611111111111111 | 0 |
| 0.7618055555555556 | 0 |
| 0.7625000000000001 | 0 |
| 0.7631944444444444 | 0 |
| 0.7638888888888888 | 0 |
| 0.7645833333333334 | 0 |
| 0.7652777777777778 | 0 |
| 0.7659722222222222 | 0 |
| 0.7666666666666666 | 0 |
| 0.7673611111111112 | 0 |
| 0.7680555555555556 | 0 |
| 0.7687499999999999 | 0 |
| 0.7694444444444444 | 0 |
| 0.7701388888888889 | 0 |
| 0.7708333333333334 | 0 |
| 0.7715277777777777 | 0 |
| 0.7722222222222223 | 0 |
| 0.7729166666666667 | 0 |
| 0.7736111111111111 | 0 |
| 0.7743055555555555 | 0 |
| 0.775 | 0 |
| 0.7756944444444445 | 0 |
| 0.7763888888888889 | 0 |
| 0.7770833333333332 | 0 |
| 0.7777777777777778 | 0 |
| 0.7784722222222222 | 0 |
| 0.7791666666666667 | 0 |
| 0.779861111111111 | 0 |
| 0.7805555555555556 | 0 |
| 0.78125 | 0 |
| 0.7819444444444444 | 0 |
| 0.782638888888889 | 0 |
| 0.7833333333333333 | 0 |
| 0.7840277777777778 | 0 |
| 0.7847222222222222 | 0 |
| 0.7854166666666668 | 0 |
| 0.7861111111111111 | 0 |
| 0.7868055555555555 | 0 |
| 0.7875 | 0 |
| 0.7881944444444445 | 0 |
| 0.7888888888888889 | 0 |
| 0.7895833333333333 | 0 |
| 0.7902777777777777 | 0 |
| 0.7909722222222223 | 0 |
| 0.7916666666666666 | 0 |
| 0.7923611111111111 | 0 |
| 0.7930555555555556 | 0 |
| 0.7937500000000001 | 0 |
| 0.7944444444444444 | 0 |
| 0.7951388888888888 | 0 |
| 0.7958333333333334 | 0 |
| 0.7965277777777778 | 0 |
| 0.7972222222222222 | 0 |
| 0.7979166666666666 | 0 |
| 0.7986111111111112 | 0 |
| 0.7993055555555556 | 0 |
| 0.7999999999999999 | 0 |
| 0.8006944444444444 | 0 |
| 0.8013888888888889 | 0 |
| 0.8020833333333334 | 0 |
| 0.8027777777777777 | 0 |
| 0.8034722222222223 | 0 |
| 0.8041666666666667 | 0 |
| 0.8048611111111111 | 0 |
| 0.8055555555555555 | 0 |
| 0.80625 | 0 |
| 0.8069444444444445 | 0 |
| 0.8076388888888889 | 0 |
| 0.8083333333333332 | 0 |
| 0.8090277777777778 | 0 |
| 0.8097222222222222 | 0 |
| 0.8104166666666667 | 0 |
| 0.811111111111111 | 0 |
| 0.8118055555555556 | 0 |
| 0.8125 | 0 |
| 0.8131944444444444 | 0 |
| 0.813888888888889 | 0 |
| 0.8145833333333333 | 0 |
| 0.8152777777777778 | 0 |
| 0.8159722222222222 | 0 |
| 0.8166666666666668 | 0 |
| 0.8173611111111111 | 0 |
| 0.8180555555555555 | 0 |
| 0.81875 | 0 |
| 0.8194444444444445 | 0 |
| 0.8201388888888889 | 0 |
| 0.8208333333333333 | 0 |
| 0.8215277777777777 | 0 |
| 0.8222222222222223 | 0 |
| 0.8229166666666666 | 0 |
| 0.8236111111111111 | 0 |
| 0.8243055555555556 | 0 |
| 0.8250000000000001 | 0 |
| 0.8256944444444444 | 0 |
| 0.8263888888888888 | 0 |
| 0.8270833333333334 | 0 |
| 0.8277777777777778 | 0 |
| 0.8284722222222222 | 0 |
| 0.8291666666666666 | 0 |
| 0.8298611111111112 | 0 |
| 0.8305555555555556 | 0 |
| 0.8312499999999999 | 0 |
| 0.8319444444444444 | 0 |
| 0.8326388888888889 | 0 |
| 0.8333333333333334 | 0 |
| 0.8340277777777777 | 0 |
| 0.8347222222222223 | 0 |
| 0.8354166666666667 | 0 |
| 0.8361111111111111 | 0 |
| 0.8368055555555555 | 0 |
| 0.8375 | 0 |
| 0.8381944444444445 | 0 |
| 0.8388888888888889 | 0 |
| 0.8395833333333332 | 0 |
| 0.8402777777777778 | 0 |
| 0.8409722222222222 | 0 |
| 0.8416666666666667 | 0 |
| 0.842361111111111 | 0 |
| 0.8430555555555556 | 0 |
| 0.84375 | 0 |
| 0.8444444444444444 | 0 |
| 0.845138888888889 | 0 |
| 0.8458333333333333 | 0 |
| 0.8465277777777778 | 0 |
| 0.8472222222222222 | 0 |
| 0.8479166666666668 | 0 |
| 0.8486111111111111 | 0 |
| 0.8493055555555555 | 0 |
| 0.85 | 0 |
| 0.8506944444444445 | 0 |
| 0.8513888888888889 | 0 |
| 0.8520833333333333 | 0 |
| 0.8527777777777777 | 0 |
| 0.8534722222222223 | 0 |
| 0.8541666666666666 | 0 |
| 0.8548611111111111 | 0 |
| 0.8555555555555556 | 0 |
| 0.8562500000000001 | 0 |
| 0.8569444444444444 | 0 |
| 0.8576388888888888 | 0 |
| 0.8583333333333334 | 0 |
| 0.8590277777777778 | 0 |
| 0.8597222222222222 | 0 |
| 0.8604166666666666 | 0 |
| 0.8611111111111112 | 0 |
| 0.8618055555555556 | 0 |
| 0.8624999999999999 | 0 |
| 0.8631944444444444 | 0 |
| 0.8638888888888889 | 0 |
| 0.8645833333333334 | 0 |
| 0.8652777777777777 | 0 |
| 0.8659722222222223 | 0 |
| 0.8666666666666667 | 0 |
| 0.8673611111111111 | 0 |
| 0.8680555555555555 | 0 |
| 0.86875 | 0 |
| 0.8694444444444445 | 0 |
| 0.8701388888888889 | 0 |
| 0.8708333333333332 | 0 |
| 0.8715277777777778 | 0 |
| 0.8722222222222222 | 0 |
| 0.8729166666666667 | 0 |
| 0.873611111111111 | 0 |
| 0.8743055555555556 | 0 |
| 0.875 | 0 |
| 0.8756944444444444 | 0 |
| 0.876388888888889 | 0 |
| 0.8770833333333333 | 0 |
| 0.8777777777777778 | 0 |
| 0.8784722222222222 | 0 |
| 0.8791666666666668 | 0 |
| 0.8798611111111111 | 0 |
| 0.8805555555555555 | 0 |
| 0.88125 | 0 |
| 0.8819444444444445 | 0 |
| 0.8826388888888889 | 0 |
| 0.8833333333333333 | 0 |
| 0.8840277777777777 | 0 |
| 0.8847222222222223 | 0 |
| 0.8854166666666666 | 0 |
| 0.8861111111111111 | 0 |
| 0.8868055555555556 | 0 |
| 0.8875000000000001 | 0 |
| 0.8881944444444444 | 0 |
| 0.8888888888888888 | 0 |
| 0.8895833333333334 | 0 |
| 0.8902777777777778 | 0 |
| 0.8909722222222222 | 0 |
| 0.8916666666666666 | 0 |
| 0.8923611111111112 | 0 |
| 0.8930555555555556 | 0 |
| 0.8937499999999999 | 0 |
| 0.8944444444444444 | 0 |
| 0.8951388888888889 | 0 |
| 0.8958333333333334 | 0 |
| 0.8965277777777777 | 0 |
| 0.8972222222222223 | 0 |
| 0.8979166666666667 | 0 |
| 0.8986111111111111 | 0 |
| 0.8993055555555555 | 0 |
| 0.9 | 0 |
| 0.9006944444444445 | 0 |
| 0.9013888888888889 | 0 |
| 0.9020833333333332 | 0 |
| 0.9027777777777778 | 0 |
| 0.9034722222222222 | 0 |
| 0.9041666666666667 | 0 |
| 0.904861111111111 | 0 |
| 0.9055555555555556 | 0 |
| 0.90625 | 0 |
| 0.9069444444444444 | 0 |
| 0.907638888888889 | 0 |
| 0.9083333333333333 | 0 |
| 0.9090277777777778 | 0 |
| 0.9097222222222222 | 0 |
| 0.9104166666666668 | 0 |
| 0.9111111111111111 | 0 |
| 0.9118055555555555 | 0 |
| 0.9125 | 0 |
| 0.9131944444444445 | 0 |
| 0.9138888888888889 | 0 |
| 0.9145833333333333 | 0 |
| 0.9152777777777777 | 0 |
| 0.9159722222222223 | 0 |
| 0.9166666666666666 | 0 |
| 0.9173611111111111 | 0 |
| 0.9180555555555556 | 0 |
| 0.9187500000000001 | 0 |
| 0.9194444444444444 | 0 |
| 0.9201388888888888 | 0 |
| 0.9208333333333334 | 0 |
| 0.9215277777777778 | 0 |
| 0.9222222222222222 | 0 |
| 0.9229166666666666 | 0 |
| 0.9236111111111112 | 0 |
| 0.9243055555555556 | 0 |
| 0.9249999999999999 | 0 |
| 0.9256944444444444 | 0 |
| 0.9263888888888889 | 0 |
| 0.9270833333333334 | 0 |
| 0.9277777777777777 | 0 |
| 0.9284722222222223 | 0 |
| 0.9291666666666667 | 0 |
| 0.9298611111111111 | 0 |
| 0.9305555555555555 | 0 |
| 0.93125 | 0 |
| 0.9319444444444445 | 0 |
| 0.9326388888888889 | 0 |
| 0.9333333333333332 | 0 |
| 0.9340277777777778 | 0 |
| 0.9347222222222222 | 0 |
| 0.9354166666666667 | 0 |
| 0.936111111111111 | 0 |
| 0.9368055555555556 | 0 |
| 0.9375 | 0 |
| 0.9381944444444444 | 0 |
| 0.938888888888889 | 0 |
| 0.9395833333333333 | 0 |
| 0.9402777777777778 | 0 |
| 0.9409722222222222 | 0 |
| 0.9416666666666668 | 0 |
| 0.9423611111111111 | 0 |
| 0.9430555555555555 | 0 |
| 0.94375 | 0 |
| 0.9444444444444445 | 0 |
| 0.9451388888888889 | 0 |
| 0.9458333333333333 | 0 |
| 0.9465277777777777 | 0 |
| 0.9472222222222223 | 0 |
| 0.9479166666666666 | 0 |
| 0.9486111111111111 | 0 |
| 0.9493055555555556 | 0 |
| 0.9500000000000001 | 0 |
| 0.9506944444444444 | 0 |
| 0.9513888888888888 | 0 |
| 0.9520833333333334 | 0 |
| 0.9527777777777778 | 0 |
| 0.9534722222222222 | 0 |
| 0.9541666666666666 | 0 |
| 0.9548611111111112 | 0 |
| 0.9555555555555556 | 0 |
| 0.9562499999999999 | 0 |
| 0.9569444444444444 | 0 |
| 0.9576388888888889 | 0 |
| 0.9583333333333334 | 0 |
| 0.9590277777777777 | 0 |
| 0.9597222222222223 | 0 |
| 0.9604166666666667 | 0 |
| 0.9611111111111111 | 0 |
| 0.9618055555555555 | 0 |
| 0.9625 | 0 |
| 0.9631944444444445 | 0 |
| 0.9638888888888889 | 0 |
| 0.9645833333333332 | 0 |
| 0.9652777777777778 | 0 |
| 0.9659722222222222 | 0 |
| 0.9666666666666667 | 0 |
| 0.967361111111111 | 0 |
| 0.9680555555555556 | 0 |
| 0.96875 | 0 |
| 0.9694444444444444 | 0 |
| 0.970138888888889 | 0 |
| 0.9708333333333333 | 0 |
| 0.9715277777777778 | 0 |
| 0.9722222222222222 | 0 |
| 0.9729166666666668 | 0 |
| 0.9736111111111111 | 0 |
| 0.9743055555555555 | 0 |
| 0.975 | 0 |
| 0.9756944444444445 | 0 |
| 0.9763888888888889 | 0 |
| 0.9770833333333333 | 0 |
| 0.9777777777777777 | 0 |
| 0.9784722222222223 | 0 |
| 0.9791666666666666 | 0 |
| 0.9798611111111111 | 0 |
| 0.9805555555555556 | 0 |
| 0.9812500000000001 | 0 |
| 0.9819444444444444 | 0 |
| 0.9826388888888888 | 0 |
| 0.9833333333333334 | 0 |
| 0.9840277777777778 | 0 |
| 0.9847222222222222 | 0 |
| 0.9854166666666666 | 0 |
| 0.9861111111111112 | 0 |
| 0.9868055555555556 | 0 |
| 0.9874999999999999 | 0 |
| 0.9881944444444444 | 0 |
| 0.9888888888888889 | 0 |
| 0.9895833333333334 | 0 |
| 0.9902777777777777 | 0 |
| 0.9909722222222223 | 0 |
| 0.9916666666666667 | 0 |
| 0.9923611111111111 | 0 |
| 0.9930555555555555 | 0 |
| 0.99375 | 0 |
| 0.9944444444444445 | 0 |
| 0.9951388888888889 | 0 |
| 0.9958333333333332 | 0 |
| 0.9965277777777778 | 0 |
| 0.9972222222222222 | 0 |
| 0.9979166666666667 | 0 |
| 0.998611111111111 | 0 |
| 0.9993055555555556 | 0 |